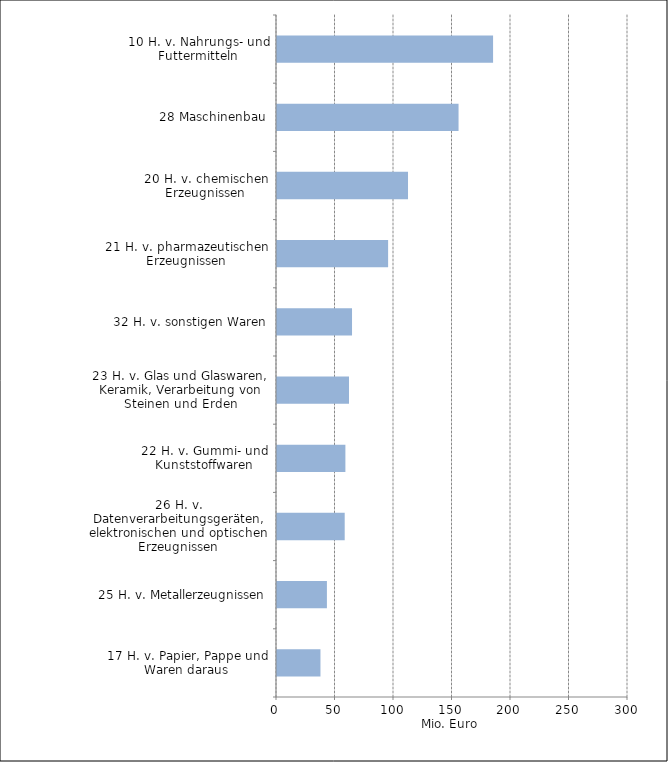
| Category | Mio. Euro |
|---|---|
| 10 H. v. Nahrungs- und Futtermitteln | 184.68 |
| 28 Maschinenbau | 155.17 |
| 20 H. v. chemischen Erzeugnissen | 111.971 |
| 21 H. v. pharmazeutischen Erzeugnissen | 94.962 |
| 32 H. v. sonstigen Waren | 64.121 |
| 23 H. v. Glas und Glaswaren, Keramik, Verarbeitung von Steinen und Erden | 61.541 |
| 22 H. v. Gummi- und Kunststoffwaren | 58.458 |
| 26 H. v. Datenverarbeitungsgeräten, elektronischen und optischen Erzeugnissen | 57.865 |
| 25 H. v. Metallerzeugnissen | 42.66 |
| 17 H. v. Papier, Pappe und Waren daraus | 37.142 |